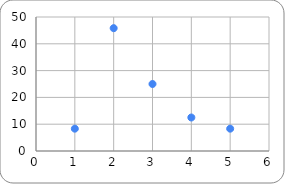
| Category | Pola Distribusi |
|---|---|
| 0 | 8.333 |
| 1 | 45.833 |
| 2 | 25 |
| 3 | 12.5 |
| 4 | 8.333 |